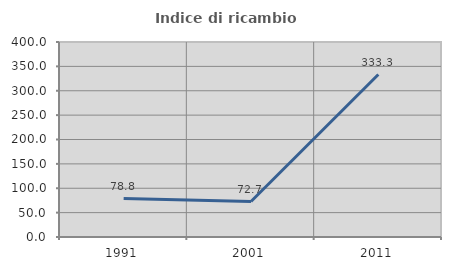
| Category | Indice di ricambio occupazionale  |
|---|---|
| 1991.0 | 78.788 |
| 2001.0 | 72.727 |
| 2011.0 | 333.333 |